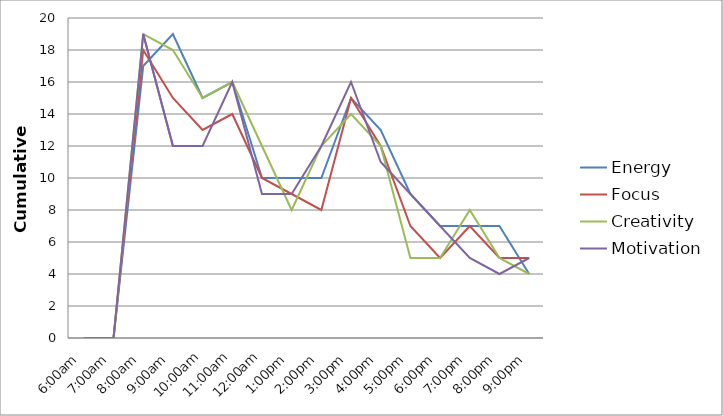
| Category | Energy | Focus | Creativity | Motivation |
|---|---|---|---|---|
| 6:00am | 0 | 0 | 0 | 0 |
| 7:00am | 0 | 0 | 0 | 0 |
| 8:00am | 17 | 18 | 19 | 19 |
| 9:00am | 19 | 15 | 18 | 12 |
| 10:00am | 15 | 13 | 15 | 12 |
| 11:00am | 16 | 14 | 16 | 16 |
| 12:00am | 10 | 10 | 12 | 9 |
| 1:00pm | 10 | 9 | 8 | 9 |
| 2:00pm | 10 | 8 | 12 | 12 |
| 3:00pm | 15 | 15 | 14 | 16 |
| 4:00pm | 13 | 12 | 12 | 11 |
| 5:00pm | 9 | 7 | 5 | 9 |
| 6:00pm | 7 | 5 | 5 | 7 |
| 7:00pm | 7 | 7 | 8 | 5 |
| 8:00pm | 7 | 5 | 5 | 4 |
| 9:00pm | 4 | 5 | 4 | 5 |